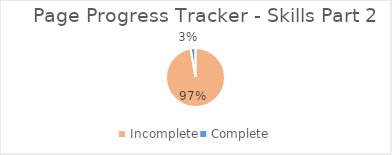
| Category | Series 0 |
|---|---|
| Incomplete | 0.973 |
| Complete | 0.027 |